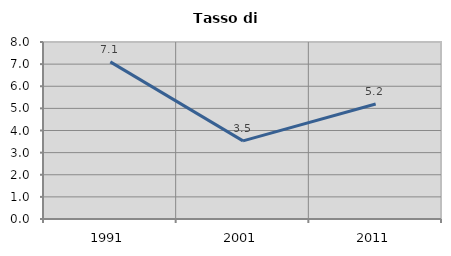
| Category | Tasso di disoccupazione   |
|---|---|
| 1991.0 | 7.102 |
| 2001.0 | 3.531 |
| 2011.0 | 5.199 |